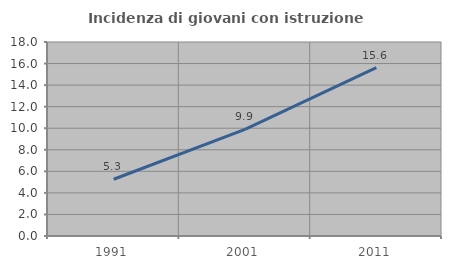
| Category | Incidenza di giovani con istruzione universitaria |
|---|---|
| 1991.0 | 5.263 |
| 2001.0 | 9.89 |
| 2011.0 | 15.625 |